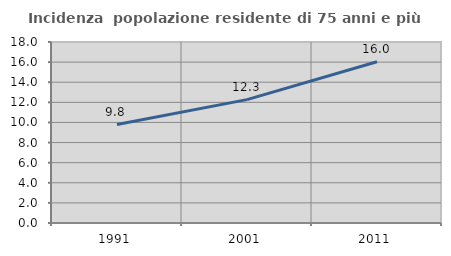
| Category | Incidenza  popolazione residente di 75 anni e più |
|---|---|
| 1991.0 | 9.792 |
| 2001.0 | 12.269 |
| 2011.0 | 16.034 |